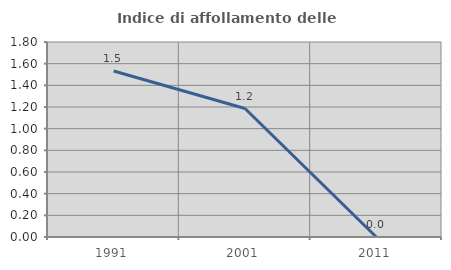
| Category | Indice di affollamento delle abitazioni  |
|---|---|
| 1991.0 | 1.533 |
| 2001.0 | 1.186 |
| 2011.0 | 0 |